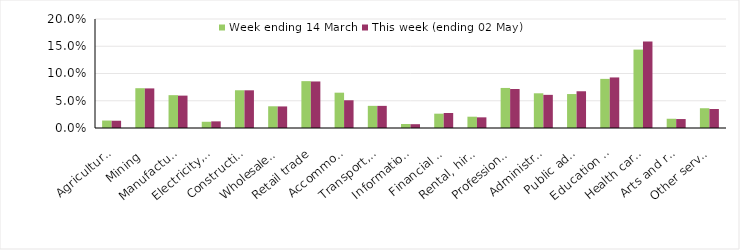
| Category | Week ending 14 March | This week (ending 02 May) |
|---|---|---|
| Agriculture, forestry and fishing | 0.014 | 0.013 |
| Mining | 0.073 | 0.073 |
| Manufacturing | 0.06 | 0.059 |
| Electricity, gas, water and waste services | 0.011 | 0.012 |
| Construction | 0.069 | 0.069 |
| Wholesale trade | 0.04 | 0.04 |
| Retail trade | 0.086 | 0.085 |
| Accommodation and food services | 0.065 | 0.051 |
| Transport, postal and warehousing | 0.041 | 0.041 |
| Information media and telecommunications | 0.007 | 0.007 |
| Financial and insurance services | 0.026 | 0.028 |
| Rental, hiring and real estate services | 0.021 | 0.02 |
| Professional, scientific and technical services | 0.073 | 0.072 |
| Administrative and support services | 0.064 | 0.061 |
| Public administration and safety | 0.062 | 0.067 |
| Education and training | 0.09 | 0.093 |
| Health care and social assistance | 0.144 | 0.159 |
| Arts and recreation services | 0.017 | 0.016 |
| Other services | 0.036 | 0.035 |